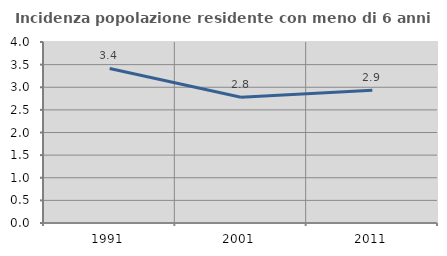
| Category | Incidenza popolazione residente con meno di 6 anni |
|---|---|
| 1991.0 | 3.415 |
| 2001.0 | 2.778 |
| 2011.0 | 2.933 |